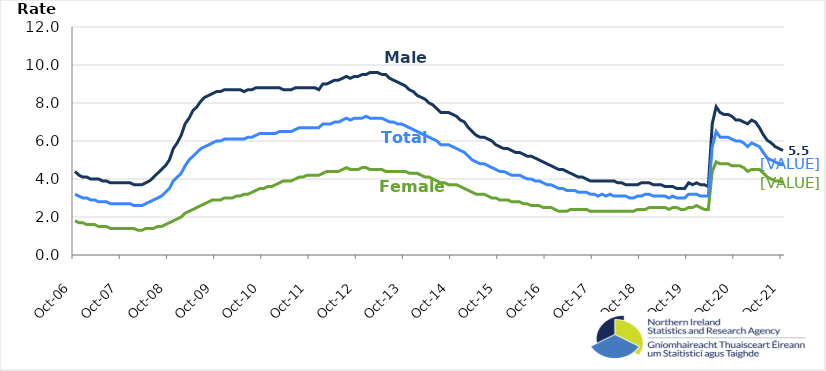
| Category | Male | Female | Total |
|---|---|---|---|
| 2006-10-01 | 4.4 | 1.8 | 3.2 |
| 2006-11-01 | 4.2 | 1.7 | 3.1 |
| 2006-12-01 | 4.1 | 1.7 | 3 |
| 2007-01-01 | 4.1 | 1.6 | 3 |
| 2007-02-01 | 4 | 1.6 | 2.9 |
| 2007-03-01 | 4 | 1.6 | 2.9 |
| 2007-04-01 | 4 | 1.5 | 2.8 |
| 2007-05-01 | 3.9 | 1.5 | 2.8 |
| 2007-06-01 | 3.9 | 1.5 | 2.8 |
| 2007-07-01 | 3.8 | 1.4 | 2.7 |
| 2007-08-01 | 3.8 | 1.4 | 2.7 |
| 2007-09-01 | 3.8 | 1.4 | 2.7 |
| 2007-10-01 | 3.8 | 1.4 | 2.7 |
| 2007-11-01 | 3.8 | 1.4 | 2.7 |
| 2007-12-01 | 3.8 | 1.4 | 2.7 |
| 2008-01-01 | 3.7 | 1.4 | 2.6 |
| 2008-02-01 | 3.7 | 1.3 | 2.6 |
| 2008-03-01 | 3.7 | 1.3 | 2.6 |
| 2008-04-01 | 3.8 | 1.4 | 2.7 |
| 2008-05-01 | 3.9 | 1.4 | 2.8 |
| 2008-06-01 | 4.1 | 1.4 | 2.9 |
| 2008-07-01 | 4.3 | 1.5 | 3 |
| 2008-08-01 | 4.5 | 1.5 | 3.1 |
| 2008-09-01 | 4.7 | 1.6 | 3.3 |
| 2008-10-01 | 5 | 1.7 | 3.5 |
| 2008-11-01 | 5.6 | 1.8 | 3.9 |
| 2008-12-01 | 5.9 | 1.9 | 4.1 |
| 2009-01-01 | 6.3 | 2 | 4.3 |
| 2009-02-01 | 6.9 | 2.2 | 4.7 |
| 2009-03-01 | 7.2 | 2.3 | 5 |
| 2009-04-01 | 7.6 | 2.4 | 5.2 |
| 2009-05-01 | 7.8 | 2.5 | 5.4 |
| 2009-06-01 | 8.1 | 2.6 | 5.6 |
| 2009-07-01 | 8.3 | 2.7 | 5.7 |
| 2009-08-01 | 8.4 | 2.8 | 5.8 |
| 2009-09-01 | 8.5 | 2.9 | 5.9 |
| 2009-10-01 | 8.6 | 2.9 | 6 |
| 2009-11-01 | 8.6 | 2.9 | 6 |
| 2009-12-01 | 8.7 | 3 | 6.1 |
| 2010-01-01 | 8.7 | 3 | 6.1 |
| 2010-02-01 | 8.7 | 3 | 6.1 |
| 2010-03-01 | 8.7 | 3.1 | 6.1 |
| 2010-04-01 | 8.7 | 3.1 | 6.1 |
| 2010-05-01 | 8.6 | 3.2 | 6.1 |
| 2010-06-01 | 8.7 | 3.2 | 6.2 |
| 2010-07-01 | 8.7 | 3.3 | 6.2 |
| 2010-08-01 | 8.8 | 3.4 | 6.3 |
| 2010-09-01 | 8.8 | 3.5 | 6.4 |
| 2010-10-01 | 8.8 | 3.5 | 6.4 |
| 2010-11-01 | 8.8 | 3.6 | 6.4 |
| 2010-12-01 | 8.8 | 3.6 | 6.4 |
| 2011-01-01 | 8.8 | 3.7 | 6.4 |
| 2011-02-01 | 8.8 | 3.8 | 6.5 |
| 2011-03-01 | 8.7 | 3.9 | 6.5 |
| 2011-04-01 | 8.7 | 3.9 | 6.5 |
| 2011-05-01 | 8.7 | 3.9 | 6.5 |
| 2011-06-01 | 8.8 | 4 | 6.6 |
| 2011-07-01 | 8.8 | 4.1 | 6.7 |
| 2011-08-01 | 8.8 | 4.1 | 6.7 |
| 2011-09-01 | 8.8 | 4.2 | 6.7 |
| 2011-10-01 | 8.8 | 4.2 | 6.7 |
| 2011-11-01 | 8.8 | 4.2 | 6.7 |
| 2011-12-01 | 8.7 | 4.2 | 6.7 |
| 2012-01-01 | 9 | 4.3 | 6.9 |
| 2012-02-01 | 9 | 4.4 | 6.9 |
| 2012-03-01 | 9.1 | 4.4 | 6.9 |
| 2012-04-01 | 9.2 | 4.4 | 7 |
| 2012-05-01 | 9.2 | 4.4 | 7 |
| 2012-06-01 | 9.3 | 4.5 | 7.1 |
| 2012-07-01 | 9.4 | 4.6 | 7.2 |
| 2012-08-01 | 9.3 | 4.5 | 7.1 |
| 2012-09-01 | 9.4 | 4.5 | 7.2 |
| 2012-10-01 | 9.4 | 4.5 | 7.2 |
| 2012-11-01 | 9.5 | 4.6 | 7.2 |
| 2012-12-01 | 9.5 | 4.6 | 7.3 |
| 2013-01-01 | 9.6 | 4.5 | 7.2 |
| 2013-02-01 | 9.6 | 4.5 | 7.2 |
| 2013-03-01 | 9.6 | 4.5 | 7.2 |
| 2013-04-01 | 9.5 | 4.5 | 7.2 |
| 2013-05-01 | 9.5 | 4.4 | 7.1 |
| 2013-06-01 | 9.3 | 4.4 | 7 |
| 2013-07-01 | 9.2 | 4.4 | 7 |
| 2013-08-01 | 9.1 | 4.4 | 6.9 |
| 2013-09-01 | 9 | 4.4 | 6.9 |
| 2013-10-01 | 8.9 | 4.4 | 6.8 |
| 2013-11-01 | 8.7 | 4.3 | 6.7 |
| 2013-12-01 | 8.6 | 4.3 | 6.6 |
| 2014-01-01 | 8.4 | 4.3 | 6.5 |
| 2014-02-01 | 8.3 | 4.2 | 6.4 |
| 2014-03-01 | 8.2 | 4.1 | 6.3 |
| 2014-04-01 | 8 | 4.1 | 6.2 |
| 2014-05-01 | 7.9 | 4 | 6.1 |
| 2014-06-01 | 7.7 | 3.9 | 6 |
| 2014-07-01 | 7.5 | 3.8 | 5.8 |
| 2014-08-01 | 7.5 | 3.8 | 5.8 |
| 2014-09-01 | 7.5 | 3.7 | 5.8 |
| 2014-10-01 | 7.4 | 3.7 | 5.7 |
| 2014-11-01 | 7.3 | 3.7 | 5.6 |
| 2014-12-01 | 7.1 | 3.6 | 5.5 |
| 2015-01-01 | 7 | 3.5 | 5.4 |
| 2015-02-01 | 6.7 | 3.4 | 5.2 |
| 2015-03-01 | 6.5 | 3.3 | 5 |
| 2015-04-01 | 6.3 | 3.2 | 4.9 |
| 2015-05-01 | 6.2 | 3.2 | 4.8 |
| 2015-06-01 | 6.2 | 3.2 | 4.8 |
| 2015-07-01 | 6.1 | 3.1 | 4.7 |
| 2015-08-01 | 6 | 3 | 4.6 |
| 2015-09-01 | 5.8 | 3 | 4.5 |
| 2015-10-01 | 5.7 | 2.9 | 4.4 |
| 2015-11-01 | 5.6 | 2.9 | 4.4 |
| 2015-12-01 | 5.6 | 2.9 | 4.3 |
| 2016-01-01 | 5.5 | 2.8 | 4.2 |
| 2016-02-01 | 5.4 | 2.8 | 4.2 |
| 2016-03-01 | 5.4 | 2.8 | 4.2 |
| 2016-04-01 | 5.3 | 2.7 | 4.1 |
| 2016-05-01 | 5.2 | 2.7 | 4 |
| 2016-06-01 | 5.2 | 2.6 | 4 |
| 2016-07-01 | 5.1 | 2.6 | 3.9 |
| 2016-08-01 | 5 | 2.6 | 3.9 |
| 2016-09-01 | 4.9 | 2.5 | 3.8 |
| 2016-10-01 | 4.8 | 2.5 | 3.7 |
| 2016-11-01 | 4.7 | 2.5 | 3.7 |
| 2016-12-01 | 4.6 | 2.4 | 3.6 |
| 2017-01-01 | 4.5 | 2.3 | 3.5 |
| 2017-02-01 | 4.5 | 2.3 | 3.5 |
| 2017-03-01 | 4.4 | 2.3 | 3.4 |
| 2017-04-01 | 4.3 | 2.4 | 3.4 |
| 2017-05-01 | 4.2 | 2.4 | 3.4 |
| 2017-06-01 | 4.1 | 2.4 | 3.3 |
| 2017-07-01 | 4.1 | 2.4 | 3.3 |
| 2017-08-01 | 4 | 2.4 | 3.3 |
| 2017-09-01 | 3.9 | 2.3 | 3.2 |
| 2017-10-01 | 3.9 | 2.3 | 3.2 |
| 2017-11-01 | 3.9 | 2.3 | 3.1 |
| 2017-12-01 | 3.9 | 2.3 | 3.2 |
| 2018-01-01 | 3.9 | 2.3 | 3.1 |
| 2018-02-01 | 3.9 | 2.3 | 3.2 |
| 2018-03-01 | 3.9 | 2.3 | 3.1 |
| 2018-04-01 | 3.8 | 2.3 | 3.1 |
| 2018-05-01 | 3.8 | 2.3 | 3.1 |
| 2018-06-01 | 3.7 | 2.3 | 3.1 |
| 2018-07-01 | 3.7 | 2.3 | 3 |
| 2018-08-01 | 3.7 | 2.3 | 3 |
| 2018-09-01 | 3.7 | 2.4 | 3.1 |
| 2018-10-01 | 3.8 | 2.4 | 3.1 |
| 2018-11-01 | 3.8 | 2.4 | 3.2 |
| 2018-12-01 | 3.8 | 2.5 | 3.2 |
| 2019-01-01 | 3.7 | 2.5 | 3.1 |
| 2019-02-01 | 3.7 | 2.5 | 3.1 |
| 2019-03-01 | 3.7 | 2.5 | 3.1 |
| 2019-04-01 | 3.6 | 2.5 | 3.1 |
| 2019-05-01 | 3.6 | 2.4 | 3 |
| 2019-06-01 | 3.6 | 2.5 | 3.1 |
| 2019-07-01 | 3.5 | 2.5 | 3 |
| 2019-08-01 | 3.5 | 2.4 | 3 |
| 2019-09-01 | 3.5 | 2.4 | 3 |
| 2019-10-01 | 3.8 | 2.5 | 3.2 |
| 2019-11-01 | 3.7 | 2.5 | 3.2 |
| 2019-12-01 | 3.8 | 2.6 | 3.2 |
| 2020-01-01 | 3.7 | 2.5 | 3.1 |
| 2020-02-01 | 3.7 | 2.4 | 3.1 |
| 2020-03-01 | 3.6 | 2.4 | 3.1 |
| 2020-04-01 | 6.9 | 4.4 | 5.7 |
| 2020-05-01 | 7.8 | 4.9 | 6.5 |
| 2020-06-01 | 7.5 | 4.8 | 6.2 |
| 2020-07-01 | 7.4 | 4.8 | 6.2 |
| 2020-08-01 | 7.4 | 4.8 | 6.2 |
| 2020-09-01 | 7.3 | 4.7 | 6.1 |
| 2020-10-01 | 7.1 | 4.7 | 6 |
| 2020-11-01 | 7.1 | 4.7 | 6 |
| 2020-12-01 | 7 | 4.6 | 5.9 |
| 2021-01-01 | 6.9 | 4.4 | 5.7 |
| 2021-02-01 | 7.1 | 4.5 | 5.9 |
| 2021-03-01 | 7 | 4.5 | 5.8 |
| 2021-04-01 | 6.7 | 4.5 | 5.7 |
| 2021-05-01 | 6.326 | 4.311 | 5.393 |
| 2021-06-01 | 6.036 | 4.1 | 5.1 |
| 2021-07-01 | 5.9 | 4 | 5 |
| 2021-08-01 | 5.7 | 3.9 | 4.9 |
| 2021-09-01 | 5.6 | 3.9 | 4.8 |
| 2021-10-01 | 5.5 | 3.8 | 4.8 |